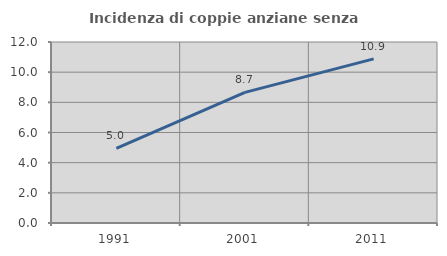
| Category | Incidenza di coppie anziane senza figli  |
|---|---|
| 1991.0 | 4.95 |
| 2001.0 | 8.661 |
| 2011.0 | 10.884 |